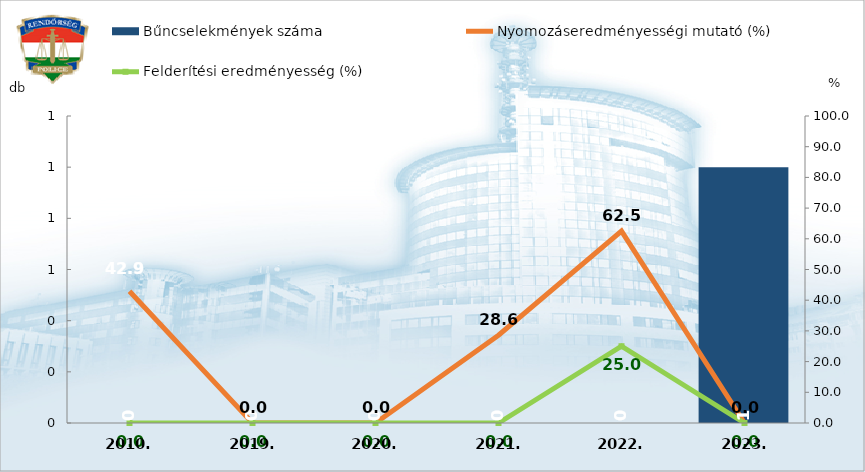
| Category | Bűncselekmények száma |
|---|---|
| 2010. | 0 |
| 2019. | 0 |
| 2020. | 0 |
| 2021. | 0 |
| 2022. | 0 |
| 2023. | 1 |